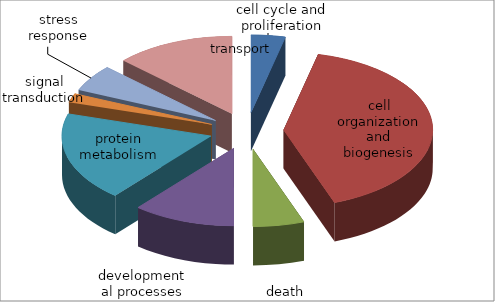
| Category | Series 0 |
|---|---|
| cell cycle and proliferation | 2 |
| cell organization and biogenesis | 22 |
| death | 3 |
| developmental processes | 6 |
| protein metabolism | 10 |
| signal transduction | 1 |
| stress response | 3 |
| transport | 7 |